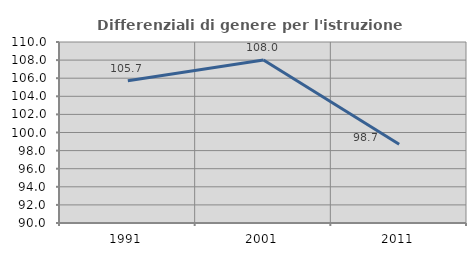
| Category | Differenziali di genere per l'istruzione superiore |
|---|---|
| 1991.0 | 105.725 |
| 2001.0 | 108.003 |
| 2011.0 | 98.692 |